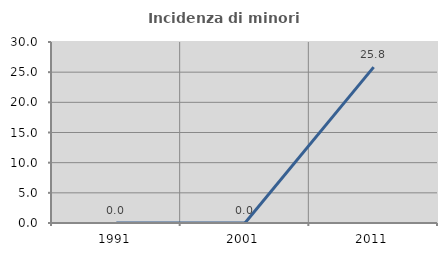
| Category | Incidenza di minori stranieri |
|---|---|
| 1991.0 | 0 |
| 2001.0 | 0 |
| 2011.0 | 25.833 |